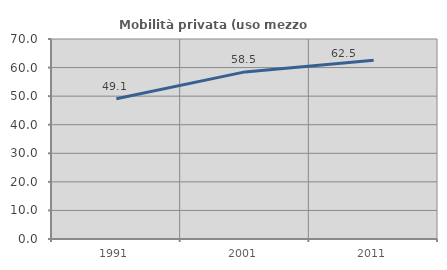
| Category | Mobilità privata (uso mezzo privato) |
|---|---|
| 1991.0 | 49.103 |
| 2001.0 | 58.484 |
| 2011.0 | 62.523 |